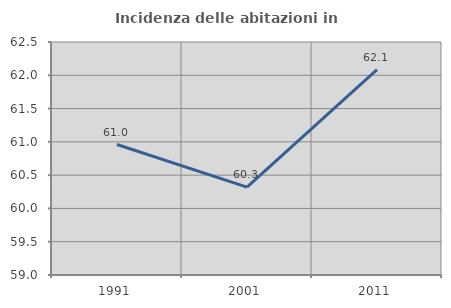
| Category | Incidenza delle abitazioni in proprietà  |
|---|---|
| 1991.0 | 60.96 |
| 2001.0 | 60.319 |
| 2011.0 | 62.084 |